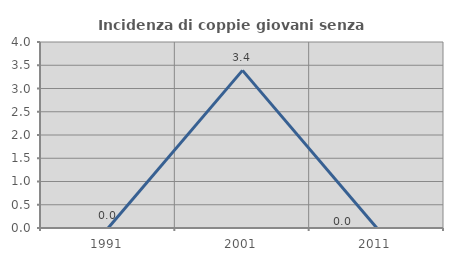
| Category | Incidenza di coppie giovani senza figli |
|---|---|
| 1991.0 | 0 |
| 2001.0 | 3.39 |
| 2011.0 | 0 |